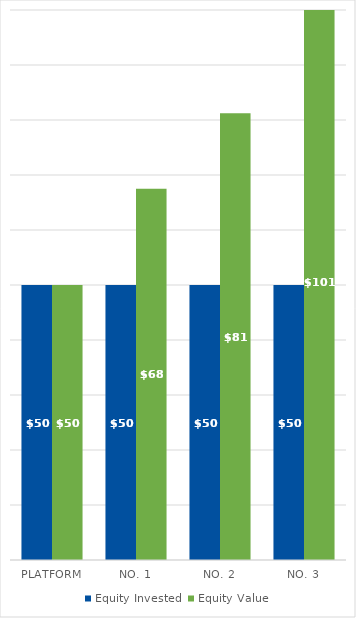
| Category | Equity Invested | Equity Value |
|---|---|---|
| Platform | 50 | 50 |
| No. 1 | 50 | 67.5 |
| No. 2 | 50 | 81.25 |
| No. 3 | 50 | 101.25 |